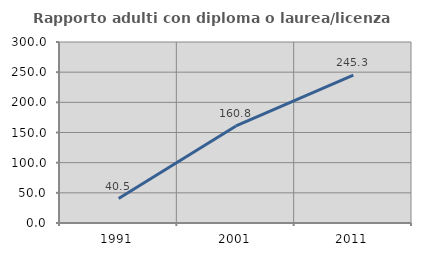
| Category | Rapporto adulti con diploma o laurea/licenza media  |
|---|---|
| 1991.0 | 40.517 |
| 2001.0 | 160.811 |
| 2011.0 | 245.283 |